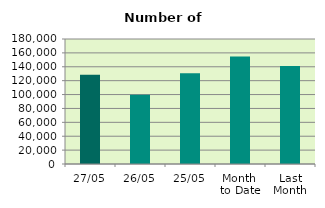
| Category | Series 0 |
|---|---|
| 27/05 | 128362 |
| 26/05 | 99620 |
| 25/05 | 130530 |
| Month 
to Date | 154636.9 |
| Last
Month | 140978.316 |